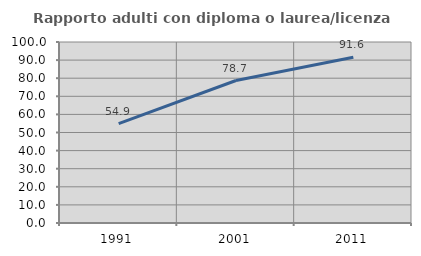
| Category | Rapporto adulti con diploma o laurea/licenza media  |
|---|---|
| 1991.0 | 54.93 |
| 2001.0 | 78.723 |
| 2011.0 | 91.589 |